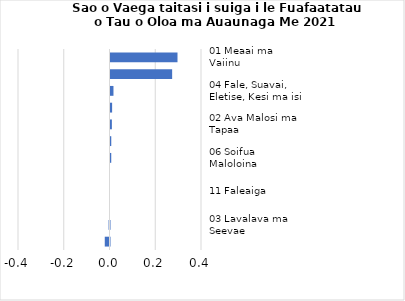
| Category |     Contributions |
|---|---|
| 01 Meaai ma Vaiinu | 0.293 |
| 07 Femalagaiga | 0.27 |
| 04 Fale, Suavai, Eletise, Kesi ma isi | 0.013 |
| 09 Faafiafiaga ma Aganuu | 0.007 |
| 02 Ava Malosi ma Tapaa | 0.006 |
| 12 Isi Oloa ma Auaunaga | 0.003 |
| 06 Soifua Maloloina | 0.003 |
| 08 Fesootaiga | 0 |
| 11 Faleaiga | 0 |
| 10 Aoaoga | 0 |
| 03 Lavalava ma Seevae | -0.004 |
| 05 Meafale, Mea Faigaluega mo Faaleleia o Aiga | -0.021 |